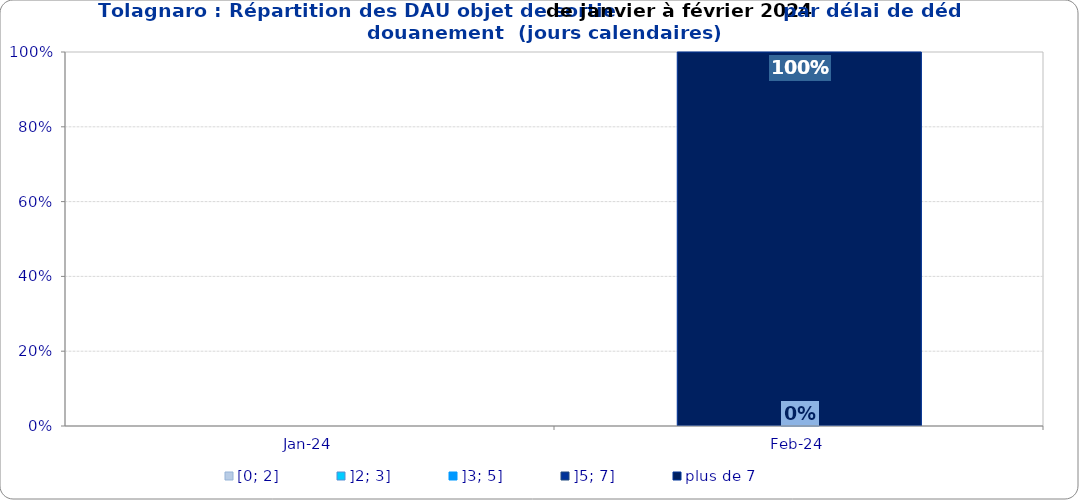
| Category | [0; 2] | ]2; 3] | ]3; 5] | ]5; 7] | plus de 7 |
|---|---|---|---|---|---|
| 2024-01-01 | 0 | 0 | 0 | 0 | 0 |
| 2024-02-01 | 0 | 0 | 0 | 0 | 1 |